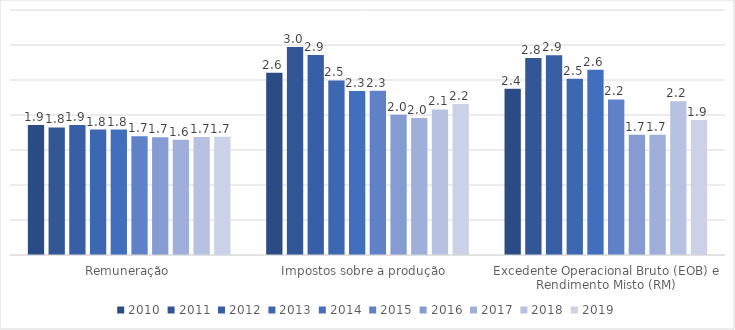
| Category | 2010 | 2011 | 2012 | 2013 | 2014 | 2015 | 2016 | 2017 | 2018 | 2019 |
|---|---|---|---|---|---|---|---|---|---|---|
| Remuneração | 1.856 | 1.823 | 1.856 | 1.791 | 1.791 | 1.698 | 1.682 | 1.648 | 1.687 | 1.69 |
| Impostos sobre a produção  | 2.605 | 2.971 | 2.855 | 2.494 | 2.344 | 2.348 | 2.004 | 1.956 | 2.08 | 2.158 |
| Excedente Operacional Bruto (EOB) e Rendimento Misto (RM) | 2.374 | 2.816 | 2.852 | 2.517 | 2.645 | 2.222 | 1.717 | 1.717 | 2.197 | 1.927 |